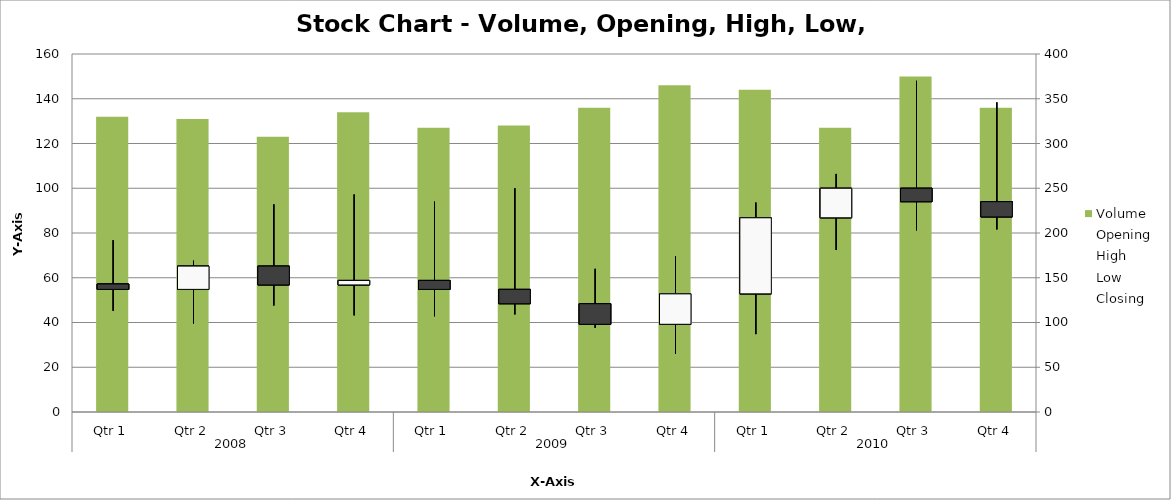
| Category | Volume |
|---|---|
| 0 | 132 |
| 1 | 131 |
| 2 | 123 |
| 3 | 134 |
| 4 | 127 |
| 5 | 128 |
| 6 | 136 |
| 7 | 146 |
| 8 | 144 |
| 9 | 127 |
| 10 | 150 |
| 11 | 136 |